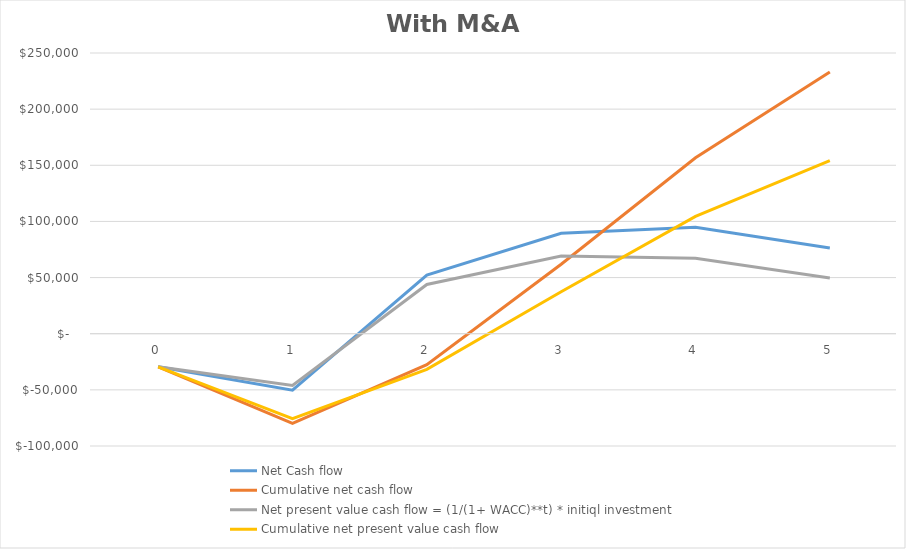
| Category | Net Cash flow | Cumulative net cash flow | Net present value cash flow = (1/(1+ WACC)**t) * initiql investment | Cumulative net present value cash flow |
|---|---|---|---|---|
| 0.0 | -29500 | -29500 | -29500 | -29500 |
| 1.0 | -50250 | -79750 | -46100.917 | -75600.917 |
| 2.0 | 52130 | -27620 | 43876.778 | -31724.139 |
| 3.0 | 89505 | 61885 | 69114.282 | 37390.143 |
| 4.0 | 94755 | 156640 | 67126.831 | 104516.974 |
| 5.0 | 76355 | 232995 | 49625.511 | 154142.485 |